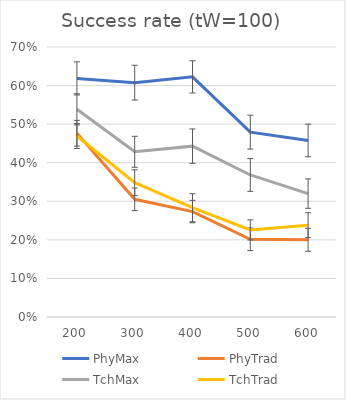
| Category | PhyMax | PhyTrad | TchMax | TchTrad |
|---|---|---|---|---|
| 200.0 | 0.619 | 0.476 | 0.538 | 0.469 |
| 300.0 | 0.608 | 0.305 | 0.428 | 0.348 |
| 400.0 | 0.623 | 0.273 | 0.443 | 0.283 |
| 500.0 | 0.479 | 0.201 | 0.368 | 0.226 |
| 600.0 | 0.458 | 0.2 | 0.32 | 0.238 |